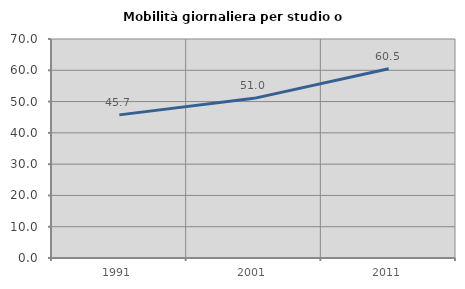
| Category | Mobilità giornaliera per studio o lavoro |
|---|---|
| 1991.0 | 45.746 |
| 2001.0 | 51.029 |
| 2011.0 | 60.465 |